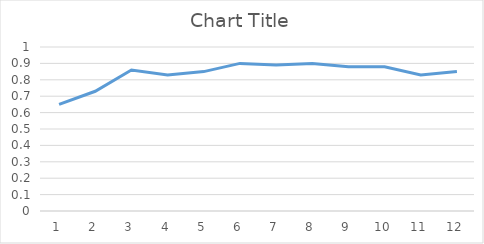
| Category | Series 0 |
|---|---|
| 0 | 0.65 |
| 1 | 0.73 |
| 2 | 0.86 |
| 3 | 0.83 |
| 4 | 0.85 |
| 5 | 0.9 |
| 6 | 0.89 |
| 7 | 0.9 |
| 8 | 0.88 |
| 9 | 0.88 |
| 10 | 0.83 |
| 11 | 0.85 |